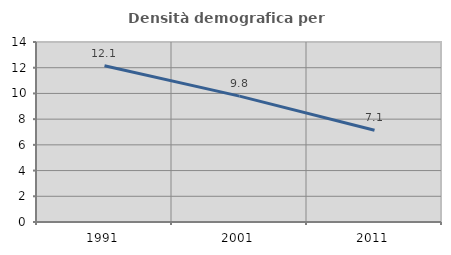
| Category | Densità demografica |
|---|---|
| 1991.0 | 12.149 |
| 2001.0 | 9.79 |
| 2011.0 | 7.136 |